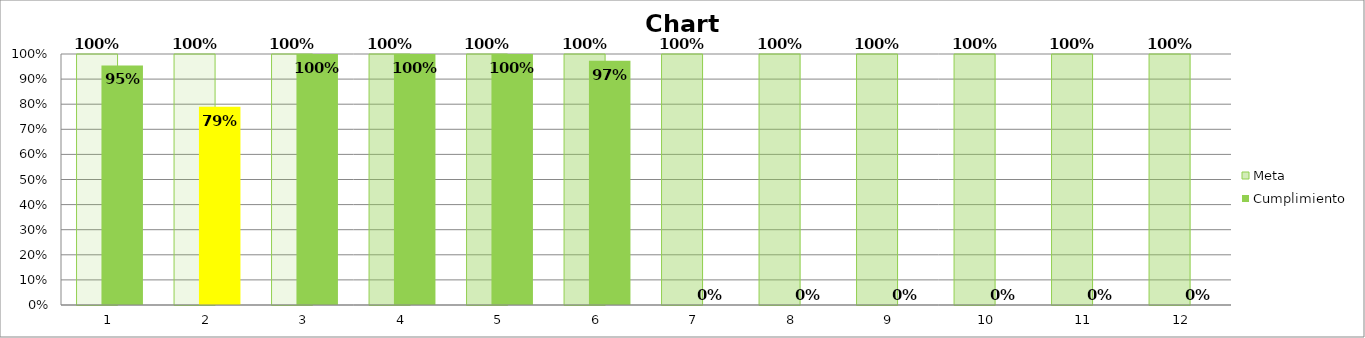
| Category | Meta | Cumplimiento |
|---|---|---|
| 0 | 1 | 0.955 |
| 1 | 1 | 0.789 |
| 2 | 1 | 1 |
| 3 | 1 | 1 |
| 4 | 1 | 1 |
| 5 | 1 | 0.973 |
| 6 | 1 | 0 |
| 7 | 1 | 0 |
| 8 | 1 | 0 |
| 9 | 1 | 0 |
| 10 | 1 | 0 |
| 11 | 1 | 0 |